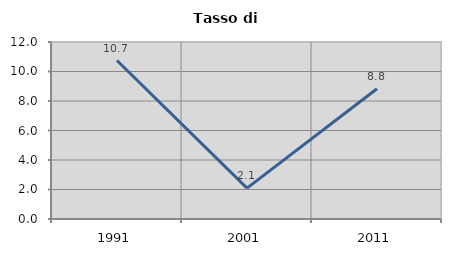
| Category | Tasso di disoccupazione   |
|---|---|
| 1991.0 | 10.742 |
| 2001.0 | 2.092 |
| 2011.0 | 8.835 |